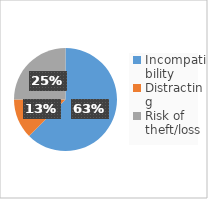
| Category | Series 0 |
|---|---|
| Incompatibility | 5 |
| Distracting | 1 |
| Risk of theft/loss | 2 |